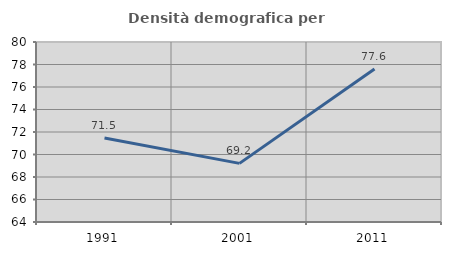
| Category | Densità demografica |
|---|---|
| 1991.0 | 71.464 |
| 2001.0 | 69.211 |
| 2011.0 | 77.607 |